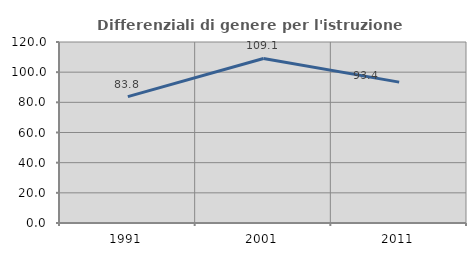
| Category | Differenziali di genere per l'istruzione superiore |
|---|---|
| 1991.0 | 83.785 |
| 2001.0 | 109.074 |
| 2011.0 | 93.389 |